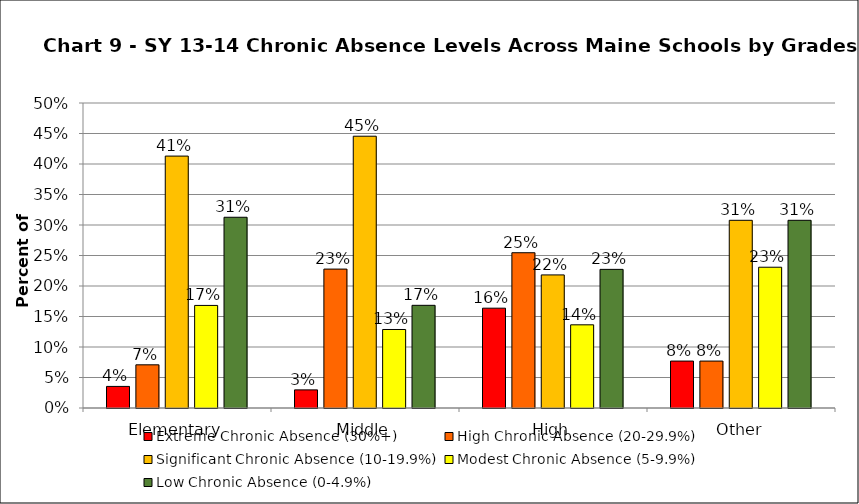
| Category | Extreme Chronic Absence (30%+) | High Chronic Absence (20-29.9%) | Significant Chronic Absence (10-19.9%) | Modest Chronic Absence (5-9.9%) | Low Chronic Absence (0-4.9%) |
|---|---|---|---|---|---|
| 0 | 0.035 | 0.071 | 0.413 | 0.168 | 0.313 |
| 1 | 0.03 | 0.228 | 0.446 | 0.129 | 0.168 |
| 2 | 0.164 | 0.255 | 0.218 | 0.136 | 0.227 |
| 3 | 0.077 | 0.077 | 0.308 | 0.231 | 0.308 |